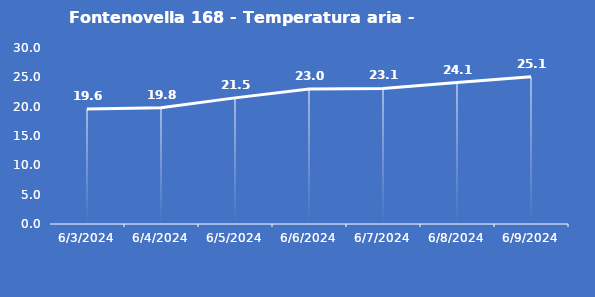
| Category | Fontenovella 168 - Temperatura aria - Grezzo (°C) |
|---|---|
| 6/3/24 | 19.6 |
| 6/4/24 | 19.8 |
| 6/5/24 | 21.5 |
| 6/6/24 | 23 |
| 6/7/24 | 23.1 |
| 6/8/24 | 24.1 |
| 6/9/24 | 25.1 |